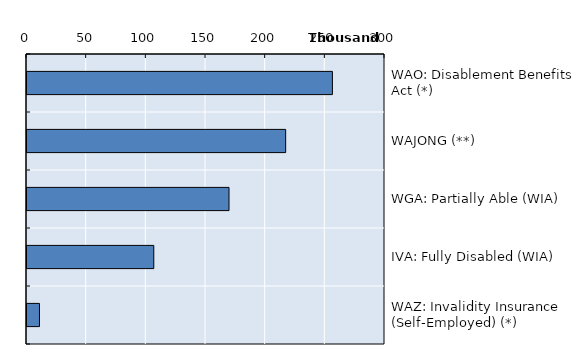
| Category | Series 0 |
|---|---|
| WAO: Disablement Benefits Act (*) | 255915.8 |
| WAJONG (**) | 216761.7 |
| WGA: Partially Able (WIA) | 169297.5 |
| IVA: Fully Disabled (WIA) | 106243.3 |
| WAZ: Invalidity Insurance (Self-Employed) (*) | 10440.83 |